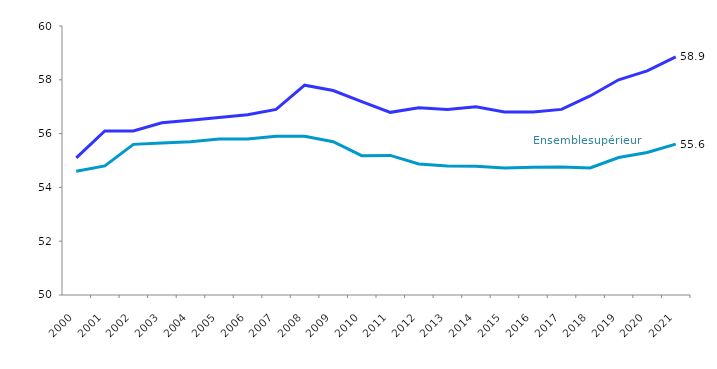
| Category | Ensemble Supérieur | Universités (1) |
|---|---|---|
| 2000.0 | 54.6 | 55.1 |
| 2001.0 | 54.8 | 56.1 |
| 2002.0 | 55.6 | 56.1 |
| 2003.0 | 55.65 | 56.4 |
| 2004.0 | 55.7 | 56.5 |
| 2005.0 | 55.8 | 56.6 |
| 2006.0 | 55.8 | 56.7 |
| 2007.0 | 55.9 | 56.9 |
| 2008.0 | 55.9 | 57.8 |
| 2009.0 | 55.7 | 57.6 |
| 2010.0 | 55.18 | 57.19 |
| 2011.0 | 55.19 | 56.79 |
| 2012.0 | 54.87 | 56.96 |
| 2013.0 | 54.8 | 56.9 |
| 2014.0 | 54.79 | 57 |
| 2015.0 | 54.72 | 56.8 |
| 2016.0 | 54.75 | 56.8 |
| 2017.0 | 54.76 | 56.9 |
| 2018.0 | 54.72 | 57.4 |
| 2019.0 | 55.11 | 58 |
| 2020.0 | 55.3 | 58.33 |
| 2021.0 | 55.61 | 58.85 |